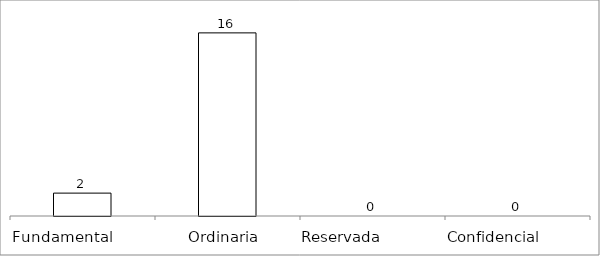
| Category | Series 0 |
|---|---|
| Fundamental         | 2 |
| Ordinaria  | 16 |
| Reservada               | 0 |
| Confidencial             | 0 |